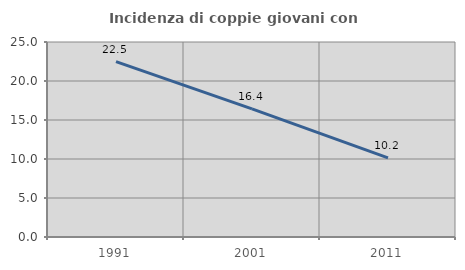
| Category | Incidenza di coppie giovani con figli |
|---|---|
| 1991.0 | 22.479 |
| 2001.0 | 16.422 |
| 2011.0 | 10.151 |